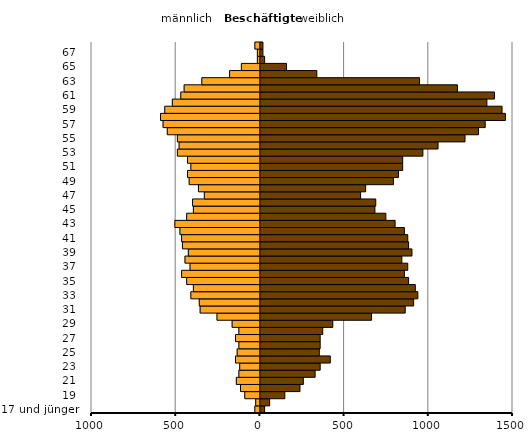
| Category | Männer | Frauen |
|---|---|---|
| 17 und jünger  | -30 | 25 |
| 18  | -25 | 55 |
| 19  | -90 | 145 |
| 20  | -115 | 235 |
| 21  | -140 | 255 |
| 22  | -125 | 325 |
| 23  | -120 | 355 |
| 24  | -145 | 415 |
| 25  | -135 | 350 |
| 26  | -125 | 355 |
| 27  | -145 | 355 |
| 28  | -125 | 370 |
| 29  | -165 | 430 |
| 30  | -255 | 660 |
| 31  | -355 | 860 |
| 32  | -360 | 910 |
| 33  | -410 | 935 |
| 34  | -395 | 920 |
| 35  | -435 | 880 |
| 36  | -465 | 855 |
| 37  | -415 | 875 |
| 38  | -445 | 840 |
| 39  | -425 | 900 |
| 40  | -460 | 880 |
| 41  | -465 | 875 |
| 42  | -475 | 855 |
| 43  | -505 | 800 |
| 44  | -435 | 745 |
| 45  | -395 | 680 |
| 46  | -400 | 685 |
| 47  | -330 | 595 |
| 48  | -365 | 625 |
| 49  | -420 | 790 |
| 50  | -430 | 820 |
| 51  | -410 | 845 |
| 52  | -430 | 845 |
| 53  | -490 | 965 |
| 54  | -480 | 1055 |
| 55  | -490 | 1215 |
| 56  | -550 | 1295 |
| 57  | -575 | 1335 |
| 58  | -590 | 1455 |
| 59  | -565 | 1435 |
| 60  | -520 | 1345 |
| 61  | -470 | 1390 |
| 62  | -450 | 1170 |
| 63  | -345 | 945 |
| 64  | -180 | 335 |
| 65  | -110 | 155 |
| 66  | -15 | 25 |
| 67  | -15 | 15 |
| 68 und älter  | -30 | 15 |